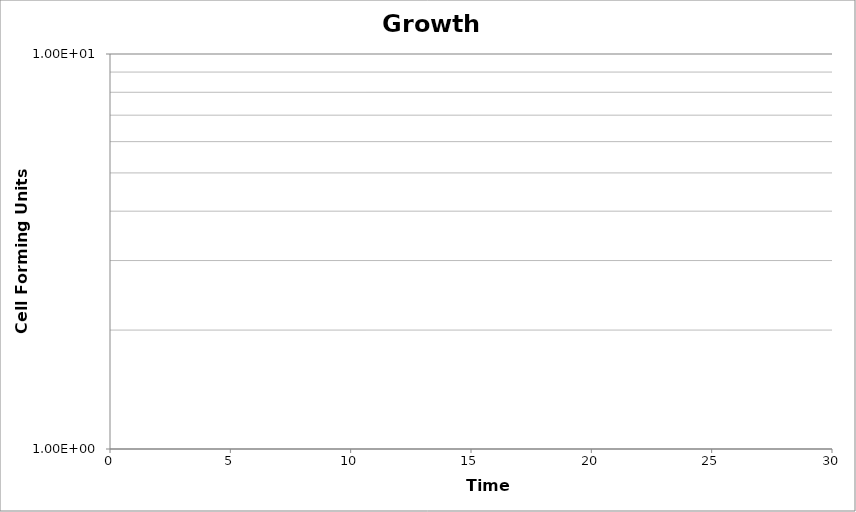
| Category | Colonies |
|---|---|
| 0.0 | 0 |
| 1.0 | 0 |
| 2.0 | 0 |
| 3.0 | 0 |
| 4.0 | 0 |
| 5.0 | 0 |
| 6.0 | 0 |
| 7.0 | 0 |
| 8.0 | 0 |
| 9.0 | 0 |
| 10.0 | 0 |
| 11.0 | 0 |
| 12.0 | 0 |
| 13.0 | 0 |
| 14.0 | 0 |
| 15.0 | 0 |
| 16.0 | 0 |
| 17.0 | 0 |
| 18.0 | 0 |
| 19.0 | 0 |
| 20.0 | 0 |
| 21.0 | 0 |
| 22.0 | 0 |
| 23.0 | 0 |
| 24.0 | 0 |